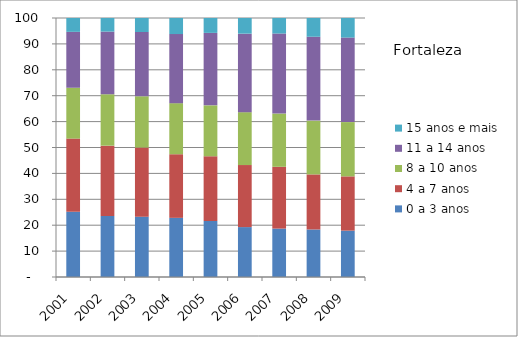
| Category | 0 a 3 anos | 4 a 7 anos | 8 a 10 anos | 11 a 14 anos | 15 anos e mais |
|---|---|---|---|---|---|
| 2001.0 | 25.21 | 28.23 | 19.63 | 21.58 | 5.35 |
| 2002.0 | 23.55 | 27.16 | 19.85 | 24.19 | 5.26 |
| 2003.0 | 23.29 | 26.69 | 19.79 | 24.82 | 5.41 |
| 2004.0 | 22.84 | 24.56 | 19.72 | 26.68 | 6.2 |
| 2005.0 | 21.65 | 24.96 | 19.66 | 27.98 | 5.75 |
| 2006.0 | 19.27 | 23.96 | 20.41 | 30.31 | 6.05 |
| 2007.0 | 18.69 | 23.86 | 20.56 | 30.89 | 6 |
| 2008.0 | 18.35 | 21.26 | 20.77 | 32.38 | 7.24 |
| 2009.0 | 17.9 | 20.96 | 20.95 | 32.63 | 7.55 |